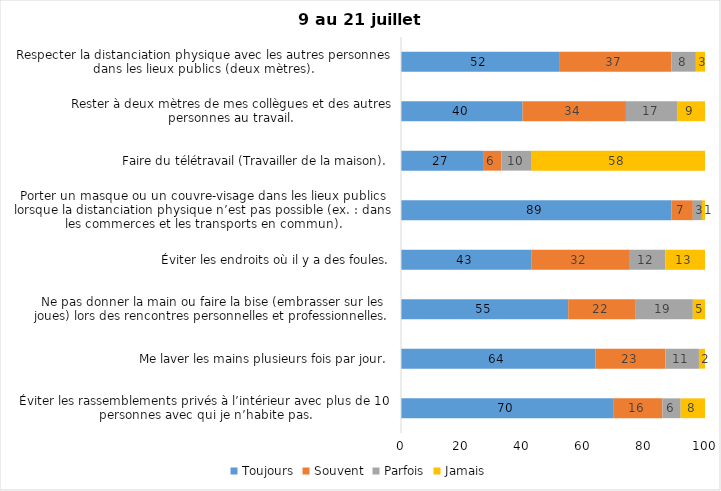
| Category | Toujours | Souvent | Parfois | Jamais |
|---|---|---|---|---|
| Éviter les rassemblements privés à l’intérieur avec plus de 10 personnes avec qui je n’habite pas. | 70 | 16 | 6 | 8 |
| Me laver les mains plusieurs fois par jour. | 64 | 23 | 11 | 2 |
| Ne pas donner la main ou faire la bise (embrasser sur les joues) lors des rencontres personnelles et professionnelles. | 55 | 22 | 19 | 5 |
| Éviter les endroits où il y a des foules. | 43 | 32 | 12 | 13 |
| Porter un masque ou un couvre-visage dans les lieux publics lorsque la distanciation physique n’est pas possible (ex. : dans les commerces et les transports en commun). | 89 | 7 | 3 | 1 |
| Faire du télétravail (Travailler de la maison). | 27 | 6 | 10 | 58 |
| Rester à deux mètres de mes collègues et des autres personnes au travail. | 40 | 34 | 17 | 9 |
| Respecter la distanciation physique avec les autres personnes dans les lieux publics (deux mètres). | 52 | 37 | 8 | 3 |